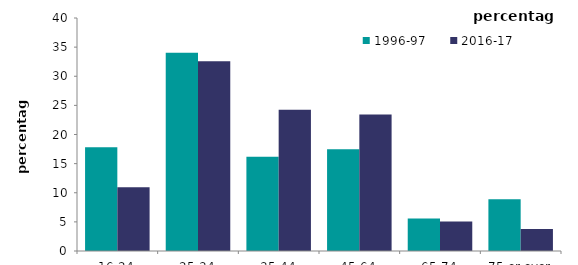
| Category | 1996-97 | 2016-17 |
|---|---|---|
| 16-24 | 17.822 | 10.928 |
| 25-34 | 34.052 | 32.582 |
| 35-44 | 16.174 | 24.228 |
| 45-64 | 17.463 | 23.434 |
| 65-74 | 5.586 | 5.064 |
| 75 or over | 8.903 | 3.764 |